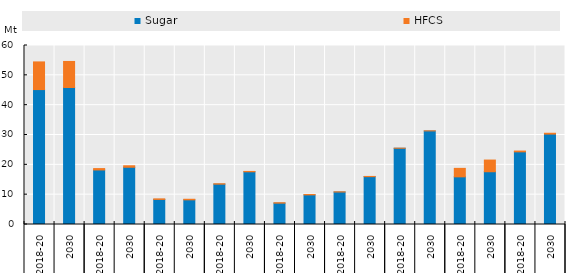
| Category | Sugar | HFCS |
|---|---|---|
| 0 | 45.227 | 9.273 |
| 1 | 45.931 | 8.721 |
| 2 | 18.274 | 0.471 |
| 3 | 19.189 | 0.496 |
| 4 | 8.4 | 0.19 |
| 5 | 8.264 | 0.195 |
| 6 | 13.528 | 0.13 |
| 7 | 17.669 | 0.119 |
| 8 | 7.16 | 0.135 |
| 9 | 9.936 | 0.12 |
| 10 | 10.893 | 0.055 |
| 11 | 16.039 | 0.074 |
| 12 | 25.559 | 0.015 |
| 13 | 31.377 | 0.014 |
| 14 | 15.973 | 2.843 |
| 15 | 17.684 | 3.917 |
| 16 | 24.353 | 0.267 |
| 17 | 30.308 | 0.276 |